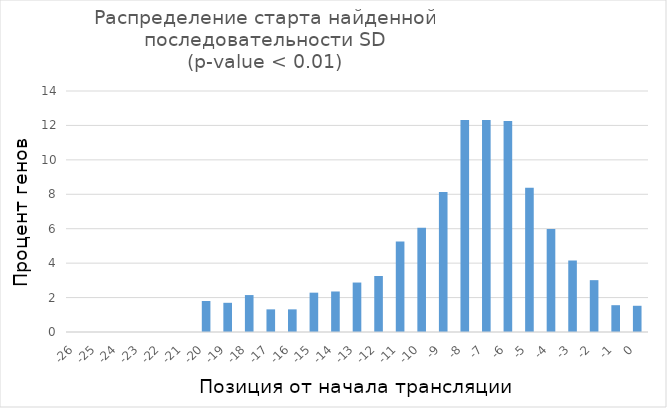
| Category | Series 0 |
|---|---|
| -26.0 | 0 |
| -25.0 | 0 |
| -24.0 | 0 |
| -23.0 | 0 |
| -22.0 | 0 |
| -21.0 | 0 |
| -20.0 | 1.8 |
| -19.0 | 1.696 |
| -18.0 | 2.146 |
| -17.0 | 1.315 |
| -16.0 | 1.315 |
| -15.0 | 2.285 |
| -14.0 | 2.354 |
| -13.0 | 2.873 |
| -12.0 | 3.254 |
| -11.0 | 5.261 |
| -10.0 | 6.057 |
| -9.0 | 8.134 |
| -8.0 | 12.323 |
| -7.0 | 12.323 |
| -6.0 | 12.253 |
| -5.0 | 8.377 |
| -4.0 | 5.988 |
| -3.0 | 4.154 |
| -2.0 | 3.011 |
| -1.0 | 1.558 |
| 0.0 | 1.523 |